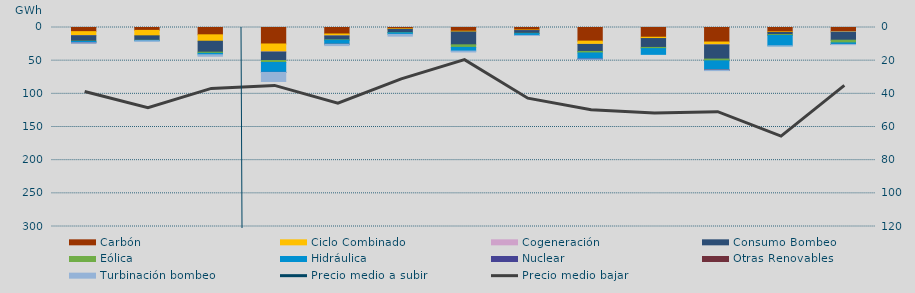
| Category | Carbón | Ciclo Combinado | Cogeneración | Consumo Bombeo | Eólica | Hidráulica | Nuclear | Otras Renovables | Turbinación bombeo |
|---|---|---|---|---|---|---|---|---|---|
| 0 | 6238.1 | 6107.2 | 11.4 | 8233.1 | 466.1 | 1774.5 | 300.5 | 0 | 185 |
| 1 | 4345.4 | 8205.3 | 0 | 6736.7 | 204.5 | 506 | 0 | 0 | 802.1 |
| 2 | 11031.5 | 9660.7 | 0 | 16502.5 | 1775.9 | 2151.2 | 0 | 0 | 2234.6 |
| 3 | 24843.5 | 12025 | 139.2 | 12696.1 | 3036.8 | 14862.1 | 109.8 | 0 | 13649 |
| 4 | 9788.3 | 2896.9 | 13 | 5978.6 | 470.2 | 6144.5 | 0 | 2 | 2006.5 |
| 5 | 1915.7 | 883.7 | 0 | 4789.3 | 395.2 | 2417.8 | 0 | 0 | 2598.3 |
| 6 | 5601.6 | 1130.8 | 0 | 19369.2 | 3910.4 | 5534.9 | 0 | 0 | 1362.4 |
| 7 | 3825.2 | 805.7 | 1 | 4108.2 | 441.1 | 2792 | 0 | 0 | 67.3 |
| 8 | 20542.2 | 4950.3 | 40.5 | 10583.3 | 2263.7 | 9147 | 197.5 | 0 | 285 |
| 9 | 14664.7 | 1989 | 0 | 13423.2 | 1723.5 | 8686.8 | 0 | 0 | 0 |
| 10 | 21887.7 | 4264.5 | 79.6 | 21354.7 | 2677.3 | 13814.3 | 70 | 3 | 823.8 |
| 11 | 6583.4 | 903.3 | 0 | 3217 | 1397.7 | 15518.8 | 0 | 0 | 135.7 |
| 12 | 6055 | 869.5 | 10.2 | 12220.9 | 4048.2 | 2358.3 | 0 | 9 | 300 |